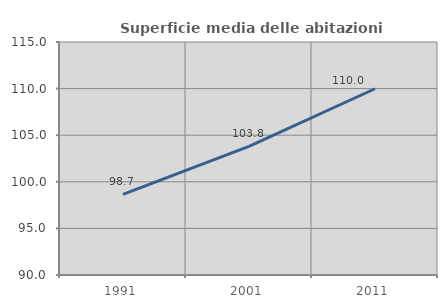
| Category | Superficie media delle abitazioni occupate |
|---|---|
| 1991.0 | 98.652 |
| 2001.0 | 103.799 |
| 2011.0 | 109.984 |